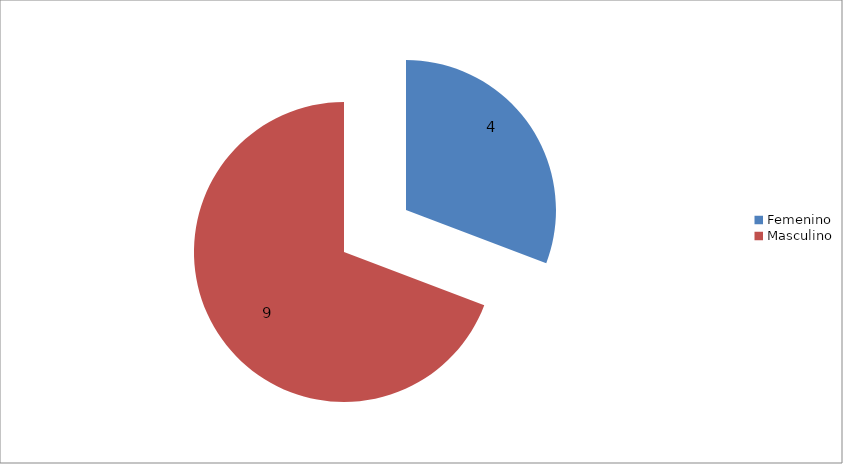
| Category | Series 0 |
|---|---|
| Femenino | 4 |
| Masculino | 9 |